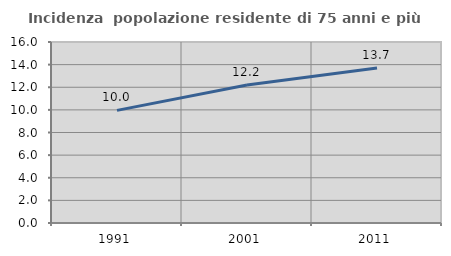
| Category | Incidenza  popolazione residente di 75 anni e più |
|---|---|
| 1991.0 | 9.954 |
| 2001.0 | 12.201 |
| 2011.0 | 13.703 |